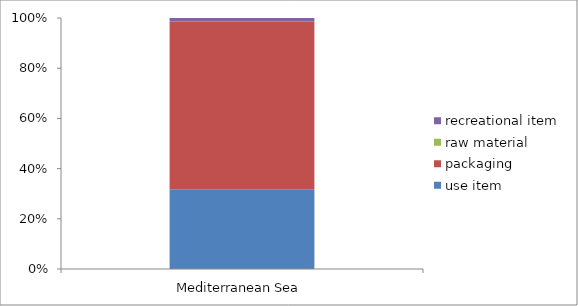
| Category | use item | packaging | raw material | recreational item |
|---|---|---|---|---|
| Mediterranean Sea | 8262 | 17371 | 4 | 350 |